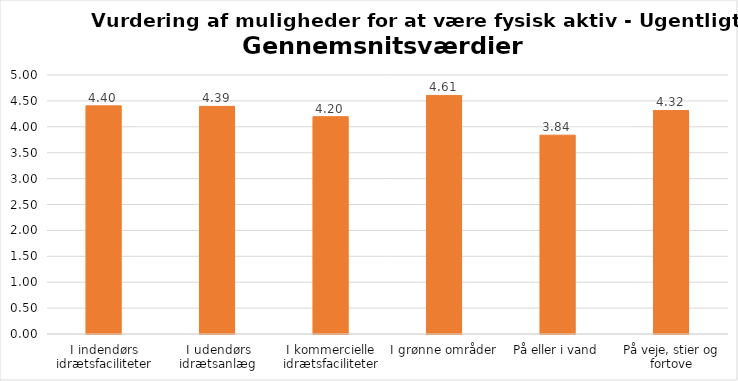
| Category | Gennemsnit |
|---|---|
| I indendørs idrætsfaciliteter | 4.404 |
| I udendørs idrætsanlæg | 4.394 |
| I kommercielle idrætsfaciliteter | 4.196 |
| I grønne områder | 4.606 |
| På eller i vand | 3.839 |
| På veje, stier og fortove | 4.315 |